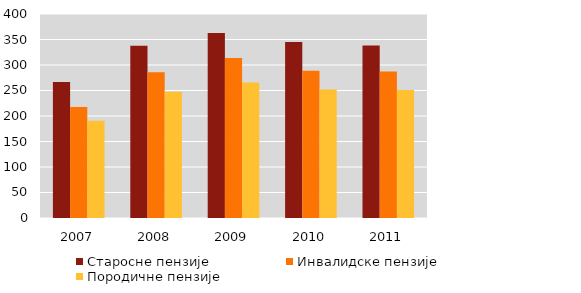
| Category | Старосне пензије | Инвалидске пензије | Породичне пензије |
|---|---|---|---|
| 2007.0 | 266.61 | 217.56 | 190.46 |
| 2008.0 | 337.81 | 285.8 | 247.69 |
| 2009.0 | 362.67 | 313.58 | 265.69 |
| 2010.0 | 345.19 | 288.52 | 252.15 |
| 2011.0 | 338.24 | 287.09 | 250.91 |